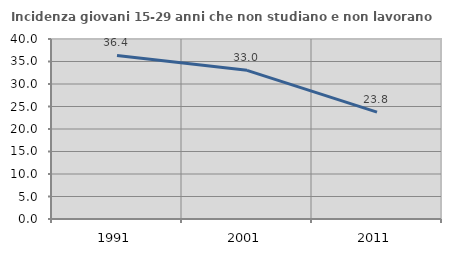
| Category | Incidenza giovani 15-29 anni che non studiano e non lavorano  |
|---|---|
| 1991.0 | 36.351 |
| 2001.0 | 33.043 |
| 2011.0 | 23.759 |